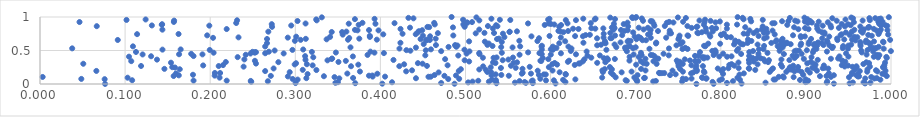
| Category | Series 0 |
|---|---|
| 0.07647637982573963 | 0.001 |
| 0.7713234375897384 | 0.002 |
| 0.7915765868308895 | 0.003 |
| 0.4871062433613019 | 0.004 |
| 0.4022201036759257 | 0.005 |
| 0.9328352677823826 | 0.006 |
| 0.824395686377587 | 0.007 |
| 0.6058112275963091 | 0.008 |
| 0.9695619018061348 | 0.009 |
| 0.9513644047671493 | 0.01 |
| 0.5364083668292864 | 0.011 |
| 0.3704286855123539 | 0.012 |
| 0.579062334779763 | 0.013 |
| 0.30029020890971697 | 0.014 |
| 0.4714186465036029 | 0.015 |
| 0.8072457885731551 | 0.016 |
| 0.5709597656700126 | 0.017 |
| 0.3471701998281966 | 0.018 |
| 0.9757652456273773 | 0.019 |
| 0.8525731390682146 | 0.02 |
| 0.5581101921567309 | 0.021 |
| 0.9245371772040472 | 0.022 |
| 0.9551566800901794 | 0.023 |
| 0.5032116511547893 | 0.024 |
| 0.9677470382751361 | 0.025 |
| 0.41368013751974325 | 0.026 |
| 0.3500511760682547 | 0.027 |
| 0.8993763308446131 | 0.028 |
| 0.6174446341373669 | 0.029 |
| 0.5695015918441472 | 0.03 |
| 0.7903145708085715 | 0.031 |
| 0.9007650499787098 | 0.032 |
| 0.24821853215967682 | 0.033 |
| 0.5358128045901285 | 0.034 |
| 0.5274835921770685 | 0.035 |
| 0.5083026025663702 | 0.036 |
| 0.7545631432089082 | 0.037 |
| 0.7205877358721092 | 0.038 |
| 0.9250561939633402 | 0.039 |
| 0.7017754556604903 | 0.04 |
| 0.26773700650244925 | 0.041 |
| 0.8142946277673381 | 0.042 |
| 0.5778167980161069 | 0.043 |
| 0.5635138541622989 | 0.044 |
| 0.7236949297072365 | 0.045 |
| 0.24766207189808145 | 0.046 |
| 0.6895478597967243 | 0.047 |
| 0.5149571626331519 | 0.048 |
| 0.9027447663789977 | 0.049 |
| 0.21939408377523312 | 0.05 |
| 0.1804432956501263 | 0.051 |
| 0.5789370794786778 | 0.052 |
| 0.5945785322725712 | 0.053 |
| 0.7984291668108743 | 0.054 |
| 0.6038354850212214 | 0.055 |
| 0.1082817355089732 | 0.056 |
| 0.6881709114515945 | 0.057 |
| 0.7012631700531549 | 0.058 |
| 0.5356583200534318 | 0.059 |
| 0.893068472038445 | 0.06 |
| 0.7007007874107786 | 0.061 |
| 0.6146769902397686 | 0.062 |
| 0.8224969875821672 | 0.063 |
| 0.9874906856658142 | 0.064 |
| 0.5310840257423538 | 0.065 |
| 0.3027576321140365 | 0.066 |
| 0.8621425945953757 | 0.067 |
| 0.8641596834299756 | 0.068 |
| 0.6290988340758557 | 0.069 |
| 0.8997078502525034 | 0.07 |
| 0.801304965465901 | 0.071 |
| 0.07598227748682558 | 0.072 |
| 0.7591374107086951 | 0.073 |
| 0.47969384964015327 | 0.074 |
| 0.29690244610174693 | 0.075 |
| 0.04856300646366569 | 0.076 |
| 0.4925680023637015 | 0.077 |
| 0.5879008601093424 | 0.078 |
| 0.7828456253119511 | 0.079 |
| 0.7553565912774245 | 0.08 |
| 0.7656094877592176 | 0.081 |
| 0.980332231881713 | 0.082 |
| 0.969747922555051 | 0.083 |
| 0.35171412124966667 | 0.084 |
| 0.7832034602111443 | 0.085 |
| 0.44178165496080357 | 0.086 |
| 0.31298154861060273 | 0.087 |
| 0.9833093172706803 | 0.088 |
| 0.7098867213316763 | 0.089 |
| 0.36790849983665935 | 0.09 |
| 0.7785132480761858 | 0.091 |
| 0.7107589906821176 | 0.092 |
| 0.8195194611918298 | 0.093 |
| 0.10297060496968935 | 0.094 |
| 0.21103708764094406 | 0.095 |
| 0.6606262967568428 | 0.096 |
| 0.8739529941830546 | 0.097 |
| 0.6984263418114264 | 0.098 |
| 0.7779321902004441 | 0.099 |
| 0.6764749430600118 | 0.1 |
| 0.950647054996109 | 0.101 |
| 0.8855937845791412 | 0.102 |
| 0.34608421794259897 | 0.103 |
| 0.9768081818266305 | 0.104 |
| 0.00312304008840671 | 0.105 |
| 0.9294628737213367 | 0.106 |
| 0.8681162411138694 | 0.107 |
| 0.4564878076853775 | 0.108 |
| 0.4591885922687457 | 0.109 |
| 0.40546229994381966 | 0.11 |
| 0.39090704356849737 | 0.111 |
| 0.9612221053432435 | 0.112 |
| 0.29128534187130567 | 0.113 |
| 0.8730872982302383 | 0.114 |
| 0.962541245086071 | 0.115 |
| 0.3336230480885195 | 0.116 |
| 0.9165266822260036 | 0.117 |
| 0.9950376192721535 | 0.118 |
| 0.15706882099002825 | 0.119 |
| 0.9241892487714695 | 0.12 |
| 0.27125321328903673 | 0.121 |
| 0.4752250439783822 | 0.122 |
| 0.5508968572556726 | 0.123 |
| 0.38655704101158916 | 0.124 |
| 0.20526833131387126 | 0.125 |
| 0.39051090870381244 | 0.126 |
| 0.4888072875986568 | 0.127 |
| 0.5305874981774307 | 0.128 |
| 0.16309741949179568 | 0.129 |
| 0.9592840884746519 | 0.13 |
| 0.9328635679292341 | 0.131 |
| 0.7021567293533167 | 0.132 |
| 0.7403598692984078 | 0.133 |
| 0.46362820632226376 | 0.134 |
| 0.542108186199725 | 0.135 |
| 0.5862325094943189 | 0.136 |
| 0.896691660055855 | 0.137 |
| 0.17976057557751937 | 0.138 |
| 0.6735217343308822 | 0.139 |
| 0.6178510602204882 | 0.14 |
| 0.8219487663469275 | 0.141 |
| 0.5943463672873532 | 0.142 |
| 0.5920193193655443 | 0.143 |
| 0.535451913295029 | 0.144 |
| 0.7469570987730978 | 0.145 |
| 0.9927308121246265 | 0.146 |
| 0.9610194125238118 | 0.147 |
| 0.3144312650077574 | 0.148 |
| 0.6176558744091809 | 0.149 |
| 0.9541768493932247 | 0.15 |
| 0.8026613491680085 | 0.151 |
| 0.9898373825569995 | 0.152 |
| 0.3963722163612588 | 0.153 |
| 0.5661855835061543 | 0.154 |
| 0.5769274205819162 | 0.155 |
| 0.36112705956686075 | 0.156 |
| 0.15979446630808608 | 0.157 |
| 0.8270588964690593 | 0.158 |
| 0.7650779124692071 | 0.159 |
| 0.926973501643361 | 0.16 |
| 0.7282946520240271 | 0.161 |
| 0.7307416281471626 | 0.162 |
| 0.7335985205752558 | 0.163 |
| 0.21164483139790471 | 0.164 |
| 0.20547858216914497 | 0.165 |
| 0.7273934279491568 | 0.166 |
| 0.5671944417140632 | 0.167 |
| 0.9542754717385341 | 0.168 |
| 0.6708623686444652 | 0.169 |
| 0.9045898451370812 | 0.17 |
| 0.7807982935142139 | 0.171 |
| 0.767620156075646 | 0.172 |
| 0.46842160044767756 | 0.173 |
| 0.683481225285979 | 0.174 |
| 0.6106153106721889 | 0.175 |
| 0.5301511406029994 | 0.176 |
| 0.2934184325164167 | 0.177 |
| 0.6614877052019644 | 0.178 |
| 0.525664519841381 | 0.179 |
| 0.8949382542955749 | 0.18 |
| 0.85758581971652 | 0.181 |
| 0.8769607251007685 | 0.182 |
| 0.9720440035797444 | 0.183 |
| 0.7554717978023077 | 0.184 |
| 0.6951656887241267 | 0.185 |
| 0.37595425906443913 | 0.186 |
| 0.9840769554724711 | 0.187 |
| 0.8865899874224761 | 0.188 |
| 0.43026786417312046 | 0.189 |
| 0.7800198387762903 | 0.19 |
| 0.7716521861583229 | 0.191 |
| 0.9633495522202083 | 0.192 |
| 0.2646008371697923 | 0.193 |
| 0.4921366461765714 | 0.194 |
| 0.06622298917313509 | 0.195 |
| 0.8008073091250019 | 0.196 |
| 0.9935559292769638 | 0.197 |
| 0.5848674038653797 | 0.198 |
| 0.9129455374507465 | 0.199 |
| 0.7432556146855355 | 0.2 |
| 0.6022813967823153 | 0.201 |
| 0.711562031673063 | 0.202 |
| 0.6608559194098221 | 0.203 |
| 0.4371717488483966 | 0.204 |
| 0.9823478303748382 | 0.205 |
| 0.8910795816828649 | 0.206 |
| 0.7718695482479873 | 0.207 |
| 0.3248058332112725 | 0.208 |
| 0.9019009955680192 | 0.209 |
| 0.840488751323352 | 0.21 |
| 0.3087456782767038 | 0.211 |
| 0.5238395016673081 | 0.212 |
| 0.9573871123780475 | 0.213 |
| 0.8794747861356426 | 0.214 |
| 0.8827529170450543 | 0.215 |
| 0.8598217342322324 | 0.216 |
| 0.5161902929106109 | 0.217 |
| 0.972364378153096 | 0.218 |
| 0.6720280556062957 | 0.219 |
| 0.1642277682282434 | 0.22 |
| 0.4945270673930318 | 0.221 |
| 0.6636375014499734 | 0.222 |
| 0.802830579742711 | 0.223 |
| 0.7522056644935975 | 0.224 |
| 0.7063696217115867 | 0.225 |
| 0.14618536680341568 | 0.226 |
| 0.5669659120226856 | 0.227 |
| 0.8333758609772516 | 0.228 |
| 0.8851409145309838 | 0.229 |
| 0.9263084211726338 | 0.23 |
| 0.796442828626188 | 0.231 |
| 0.2745110420125875 | 0.232 |
| 0.8612952355038673 | 0.233 |
| 0.8329010410293893 | 0.234 |
| 0.8088624905094565 | 0.235 |
| 0.9197742129397 | 0.236 |
| 0.8210105823880982 | 0.237 |
| 0.7705626833064289 | 0.238 |
| 0.541632979113089 | 0.239 |
| 0.9093340364301934 | 0.24 |
| 0.5590215921131546 | 0.241 |
| 0.9220444125022338 | 0.242 |
| 0.9921938390065449 | 0.243 |
| 0.9103521183888842 | 0.244 |
| 0.9075149547616448 | 0.245 |
| 0.15859204967330975 | 0.246 |
| 0.9907253498167723 | 0.247 |
| 0.9596371557129768 | 0.248 |
| 0.5296516534817423 | 0.249 |
| 0.8811934311241845 | 0.25 |
| 0.15541268293265703 | 0.251 |
| 0.5979651589725896 | 0.252 |
| 0.669663015425234 | 0.253 |
| 0.8907842964977745 | 0.254 |
| 0.9909074028142153 | 0.255 |
| 0.5754413021214181 | 0.256 |
| 0.9547556133181129 | 0.257 |
| 0.8720133453094582 | 0.258 |
| 0.23925206659145107 | 0.259 |
| 0.9751992237191632 | 0.26 |
| 0.9456020503531546 | 0.261 |
| 0.7504884478137754 | 0.262 |
| 0.5207475936204397 | 0.263 |
| 0.9593406090052569 | 0.264 |
| 0.36551347023247155 | 0.265 |
| 0.4222190680593002 | 0.266 |
| 0.7790035841834732 | 0.267 |
| 0.20999706558960052 | 0.268 |
| 0.1187675791028784 | 0.269 |
| 0.45473641797198766 | 0.27 |
| 0.7713359624022298 | 0.271 |
| 0.5533956669036051 | 0.272 |
| 0.8158622221153327 | 0.273 |
| 0.8850676178664606 | 0.274 |
| 0.9495382242649174 | 0.275 |
| 0.9211188770911878 | 0.276 |
| 0.19175714342462793 | 0.277 |
| 0.32039188132142793 | 0.278 |
| 0.47894511361642256 | 0.279 |
| 0.7654756310924113 | 0.28 |
| 0.9422093350636246 | 0.281 |
| 0.21511072038082557 | 0.282 |
| 0.9922389143273949 | 0.283 |
| 0.6283723472076866 | 0.284 |
| 0.8099989876647452 | 0.285 |
| 0.7503479181355882 | 0.286 |
| 0.9113277941508524 | 0.287 |
| 0.7005098939753842 | 0.288 |
| 0.37403418285112927 | 0.289 |
| 0.6076678703578962 | 0.29 |
| 0.8705233996421502 | 0.291 |
| 0.2992702118820362 | 0.292 |
| 0.8432188109509259 | 0.293 |
| 0.42788648013272024 | 0.294 |
| 0.3136081439104943 | 0.295 |
| 0.602004798295826 | 0.296 |
| 0.8126258034561993 | 0.297 |
| 0.9675343165290946 | 0.298 |
| 0.7552597675917789 | 0.299 |
| 0.7245841863150929 | 0.3 |
| 0.7128986750670443 | 0.301 |
| 0.050867971108573974 | 0.302 |
| 0.44953764172237914 | 0.303 |
| 0.909247414617605 | 0.304 |
| 0.2538069697856368 | 0.305 |
| 0.6330413887332856 | 0.306 |
| 0.634333739357792 | 0.307 |
| 0.7092129757361444 | 0.308 |
| 0.9016001641292634 | 0.309 |
| 0.3008969072107489 | 0.31 |
| 0.44407304338702064 | 0.311 |
| 0.9741986891779632 | 0.312 |
| 0.5352274457748127 | 0.313 |
| 0.6048420161158209 | 0.314 |
| 0.8333415328745871 | 0.315 |
| 0.6547507951781866 | 0.316 |
| 0.5564813641665212 | 0.317 |
| 0.15390875394978393 | 0.318 |
| 0.992995947607518 | 0.319 |
| 0.749521338725648 | 0.32 |
| 0.8207498612557683 | 0.321 |
| 0.5323583730911282 | 0.322 |
| 0.5606230761665837 | 0.323 |
| 0.9709786564267093 | 0.324 |
| 0.6643264721153348 | 0.325 |
| 0.2800892433882475 | 0.326 |
| 0.8555790396645632 | 0.327 |
| 0.21833975247017254 | 0.328 |
| 0.35072960748619497 | 0.329 |
| 0.905856138376555 | 0.33 |
| 0.620299325353993 | 0.331 |
| 0.7517849561404284 | 0.332 |
| 0.946254953936544 | 0.333 |
| 0.7710472148729468 | 0.334 |
| 0.8388494788895318 | 0.335 |
| 0.5042805531692741 | 0.336 |
| 0.6378304197497927 | 0.337 |
| 0.8520172310806844 | 0.338 |
| 0.7208956673849337 | 0.339 |
| 0.7060260772067741 | 0.34 |
| 0.10723916646413045 | 0.341 |
| 0.7738554240661505 | 0.342 |
| 0.7698351403233135 | 0.343 |
| 0.5890005563513502 | 0.344 |
| 0.35938165570905656 | 0.345 |
| 0.2525384589059965 | 0.346 |
| 0.5880134721408936 | 0.347 |
| 0.6217159011829595 | 0.348 |
| 0.6926590136274042 | 0.349 |
| 0.7482840783362281 | 0.35 |
| 0.9425503055555714 | 0.351 |
| 0.7638005515982499 | 0.352 |
| 0.3378348928943881 | 0.353 |
| 0.49896546156566113 | 0.354 |
| 0.5437135249873183 | 0.355 |
| 0.856561139717272 | 0.356 |
| 0.8805953038106098 | 0.357 |
| 0.8330160838314539 | 0.358 |
| 0.4153709885279462 | 0.359 |
| 0.9139377586906398 | 0.36 |
| 0.3119963529015769 | 0.361 |
| 0.6647823062351956 | 0.362 |
| 0.6674298090353306 | 0.363 |
| 0.13748080211952488 | 0.364 |
| 0.5503874404663938 | 0.365 |
| 0.8712426761192987 | 0.366 |
| 0.24014314021730876 | 0.367 |
| 0.7577039762710092 | 0.368 |
| 0.6397541900902555 | 0.369 |
| 0.8502453047803977 | 0.37 |
| 0.47605294310102786 | 0.371 |
| 0.5972801809121203 | 0.372 |
| 0.6754909632263466 | 0.373 |
| 0.3426686037674044 | 0.374 |
| 0.8975632196181282 | 0.375 |
| 0.7114674819727632 | 0.376 |
| 0.9294063091767459 | 0.377 |
| 0.7265164573559657 | 0.378 |
| 0.7246168636906567 | 0.379 |
| 0.3433194319595519 | 0.38 |
| 0.9379009052258864 | 0.381 |
| 0.7800588396779176 | 0.382 |
| 0.6665581183027426 | 0.383 |
| 0.8468938494117592 | 0.384 |
| 0.6627015304509242 | 0.385 |
| 0.8425387250254003 | 0.386 |
| 0.5907814466262841 | 0.387 |
| 0.886761236009048 | 0.388 |
| 0.9950352917575211 | 0.389 |
| 0.8372885509447779 | 0.39 |
| 0.5329592584092615 | 0.391 |
| 0.520441602196708 | 0.392 |
| 0.6478116632021378 | 0.393 |
| 0.7842336307050916 | 0.394 |
| 0.5557788967704821 | 0.395 |
| 0.5365779909032927 | 0.396 |
| 0.9848384541329944 | 0.397 |
| 0.7807577666849391 | 0.398 |
| 0.3211031152983421 | 0.399 |
| 0.9065937879048838 | 0.4 |
| 0.23227728695166638 | 0.401 |
| 0.7784511130516778 | 0.402 |
| 0.7036769301353711 | 0.403 |
| 0.9945192786346841 | 0.404 |
| 0.6928508343337134 | 0.405 |
| 0.9798236128637586 | 0.406 |
| 0.807396610909647 | 0.407 |
| 0.10457856911194256 | 0.408 |
| 0.9499271756609752 | 0.409 |
| 0.7981291382315007 | 0.41 |
| 0.3676720713080628 | 0.411 |
| 0.9393736192566341 | 0.412 |
| 0.812601555629992 | 0.413 |
| 0.13055561328902623 | 0.414 |
| 0.7220570852227406 | 0.415 |
| 0.3115530199291037 | 0.416 |
| 0.18041910234883454 | 0.417 |
| 0.8891718056513922 | 0.418 |
| 0.8333520924449603 | 0.419 |
| 0.7697001281920708 | 0.42 |
| 0.8844135626648856 | 0.421 |
| 0.7737137323829519 | 0.422 |
| 0.6432882747143885 | 0.423 |
| 0.9851631872141174 | 0.424 |
| 0.49149961545609466 | 0.425 |
| 0.6579162273046326 | 0.426 |
| 0.7388162420087794 | 0.427 |
| 0.4527731072343046 | 0.428 |
| 0.7070322801830782 | 0.429 |
| 0.7200932633786874 | 0.43 |
| 0.9862902187623362 | 0.431 |
| 0.7916321997311219 | 0.432 |
| 0.7178032716388612 | 0.433 |
| 0.38490528415814873 | 0.434 |
| 0.9833075672334283 | 0.435 |
| 0.24175923811818792 | 0.436 |
| 0.5635472180910294 | 0.437 |
| 0.6002320791785661 | 0.438 |
| 0.9713263519999649 | 0.439 |
| 0.697541729228429 | 0.44 |
| 0.1205691039407681 | 0.441 |
| 0.19090088697586446 | 0.442 |
| 0.6298332984289511 | 0.443 |
| 0.1634228131001856 | 0.444 |
| 0.589637089364203 | 0.445 |
| 0.5164785536400264 | 0.446 |
| 0.874160227324457 | 0.447 |
| 0.8238725602214062 | 0.448 |
| 0.8442300466187255 | 0.449 |
| 0.17769385689390657 | 0.45 |
| 0.895005390382774 | 0.451 |
| 0.7327281170133975 | 0.452 |
| 0.8027213597406201 | 0.453 |
| 0.5012305818582352 | 0.454 |
| 0.24736440190960832 | 0.455 |
| 0.2863455492322993 | 0.456 |
| 0.9472105562950488 | 0.457 |
| 0.6121557219413594 | 0.458 |
| 0.2646334239815435 | 0.459 |
| 0.5868824239909297 | 0.46 |
| 0.4041313487919891 | 0.461 |
| 0.516138280766091 | 0.462 |
| 0.7937049254048172 | 0.463 |
| 0.8548603796831575 | 0.464 |
| 0.7061533567750822 | 0.465 |
| 0.5426983784000741 | 0.466 |
| 0.20401536850358776 | 0.467 |
| 0.39300086496944364 | 0.468 |
| 0.25227008783576566 | 0.469 |
| 0.3476731073713475 | 0.47 |
| 0.9656811239137869 | 0.471 |
| 0.5735709735367011 | 0.472 |
| 0.2524017417208988 | 0.473 |
| 0.908321853796419 | 0.474 |
| 0.25379515347748377 | 0.475 |
| 0.7755422914576623 | 0.476 |
| 0.8334831843125867 | 0.477 |
| 0.11279092606205021 | 0.478 |
| 0.3194820022122654 | 0.479 |
| 0.2496781590958167 | 0.48 |
| 0.7939815849609905 | 0.481 |
| 0.268933919300248 | 0.482 |
| 0.3882809478918815 | 0.483 |
| 0.9247059543533496 | 0.484 |
| 0.64234870043991 | 0.485 |
| 0.9790289158298543 | 0.486 |
| 0.5046542912681073 | 0.487 |
| 0.6896709133609789 | 0.488 |
| 0.8867262420876552 | 0.489 |
| 0.4714298331107325 | 0.49 |
| 0.9999080185802784 | 0.491 |
| 0.8379492060147298 | 0.492 |
| 0.6237639817204536 | 0.493 |
| 0.7899722123016987 | 0.494 |
| 0.8690831350901767 | 0.495 |
| 0.8189900531325972 | 0.496 |
| 0.43523480953980304 | 0.497 |
| 0.8887228721591373 | 0.498 |
| 0.8918077168770168 | 0.499 |
| 0.27572890097632585 | 0.5 |
| 0.9649102566749735 | 0.501 |
| 0.7934529593621933 | 0.502 |
| 0.45335289294580855 | 0.503 |
| 0.9011373046439753 | 0.504 |
| 0.43055031085022194 | 0.505 |
| 0.9723974863114581 | 0.506 |
| 0.9093116822025947 | 0.507 |
| 0.199469282000762 | 0.508 |
| 0.29664118952920376 | 0.509 |
| 0.6655532435838034 | 0.51 |
| 0.6027683707329762 | 0.511 |
| 0.49876613029878397 | 0.512 |
| 0.14392163314085105 | 0.513 |
| 0.589707989517505 | 0.514 |
| 0.30929150994866295 | 0.515 |
| 0.16530000801331027 | 0.516 |
| 0.45937472535738605 | 0.517 |
| 0.8448569632119209 | 0.518 |
| 0.6002642657927147 | 0.519 |
| 0.6881893335356096 | 0.52 |
| 0.8501406661293516 | 0.521 |
| 0.7549439394821569 | 0.522 |
| 0.7608974122253829 | 0.523 |
| 0.9123881154922789 | 0.524 |
| 0.8204896541280116 | 0.525 |
| 0.7161552247133505 | 0.526 |
| 0.9914418686881212 | 0.527 |
| 0.9495367096085856 | 0.528 |
| 0.42240353515187995 | 0.529 |
| 0.6245079550718083 | 0.53 |
| 0.7390959836120933 | 0.531 |
| 0.0378357654959756 | 0.532 |
| 0.980560355276616 | 0.533 |
| 0.6968968194264654 | 0.534 |
| 0.9433737200353746 | 0.535 |
| 0.9824393881810384 | 0.536 |
| 0.9757432967493032 | 0.537 |
| 0.930943678930967 | 0.538 |
| 0.6068484766545612 | 0.539 |
| 0.8690259251599837 | 0.54 |
| 0.7581191771421093 | 0.541 |
| 0.9777824808079999 | 0.542 |
| 0.687452661806302 | 0.543 |
| 0.4417410268525617 | 0.544 |
| 0.8725729875937123 | 0.545 |
| 0.5552845113747497 | 0.546 |
| 0.36486713335635756 | 0.547 |
| 0.7000150720857126 | 0.548 |
| 0.9302785834858266 | 0.549 |
| 0.6772345830897579 | 0.55 |
| 0.5419481986539791 | 0.551 |
| 0.6902167730044896 | 0.552 |
| 0.4800663503317461 | 0.553 |
| 0.9317301035682866 | 0.554 |
| 0.9855379223768503 | 0.555 |
| 0.48920609105370716 | 0.556 |
| 0.5893843703405822 | 0.557 |
| 0.6026466147614211 | 0.558 |
| 0.6209349359680337 | 0.559 |
| 0.2645852807438736 | 0.56 |
| 0.5642681666114593 | 0.561 |
| 0.10924353990522337 | 0.562 |
| 0.7818562627468006 | 0.563 |
| 0.6929929538036664 | 0.564 |
| 0.8668299143656972 | 0.565 |
| 0.9437471996998775 | 0.566 |
| 0.5317423576315251 | 0.567 |
| 0.8508608664962278 | 0.568 |
| 0.9642668041230823 | 0.569 |
| 0.7803371163515468 | 0.57 |
| 0.5897216949710958 | 0.571 |
| 0.4885995301901772 | 0.572 |
| 0.9498065948879177 | 0.573 |
| 0.4905499745538905 | 0.574 |
| 0.9133128931156699 | 0.575 |
| 0.9276046384629592 | 0.576 |
| 0.7478976979771146 | 0.577 |
| 0.6547080413166866 | 0.578 |
| 0.8938006711061408 | 0.579 |
| 0.48771711327170586 | 0.58 |
| 0.46527761489442915 | 0.581 |
| 0.9206810636379099 | 0.582 |
| 0.9095036728693795 | 0.583 |
| 0.5256993544068863 | 0.584 |
| 0.8744189939334206 | 0.585 |
| 0.6593011947735044 | 0.586 |
| 0.9531872809287677 | 0.587 |
| 0.8703641097242764 | 0.588 |
| 0.843220588423308 | 0.589 |
| 0.6751798068852922 | 0.59 |
| 0.8155797091283816 | 0.591 |
| 0.826219032555915 | 0.592 |
| 0.9640817850265676 | 0.593 |
| 0.8820881558375975 | 0.594 |
| 0.824051732647325 | 0.595 |
| 0.4508724901589181 | 0.596 |
| 0.9102358172210644 | 0.597 |
| 0.9033266658116603 | 0.598 |
| 0.7525093641352234 | 0.599 |
| 0.9755244823634847 | 0.6 |
| 0.7991876124451905 | 0.601 |
| 0.785210641274348 | 0.602 |
| 0.8944409858703147 | 0.603 |
| 0.527331211128925 | 0.604 |
| 0.7238735472864296 | 0.605 |
| 0.7530727799961026 | 0.606 |
| 0.6646066591266281 | 0.607 |
| 0.6101779699671116 | 0.608 |
| 0.9189312643197889 | 0.609 |
| 0.26675552078496423 | 0.61 |
| 0.8779300894997314 | 0.611 |
| 0.8314295958788567 | 0.612 |
| 0.8593882388048188 | 0.613 |
| 0.9739380495264895 | 0.614 |
| 0.4235392903634531 | 0.615 |
| 0.6385782728667508 | 0.616 |
| 0.877317573424242 | 0.617 |
| 0.7241635882248644 | 0.618 |
| 0.6637442351556662 | 0.619 |
| 0.9142329422004979 | 0.62 |
| 0.682167613085894 | 0.621 |
| 0.9911641821312008 | 0.622 |
| 0.7550176137178627 | 0.623 |
| 0.8170797825356666 | 0.624 |
| 0.9704634010916828 | 0.625 |
| 0.9638761435965183 | 0.626 |
| 0.5426368205069452 | 0.627 |
| 0.9253282501282954 | 0.628 |
| 0.9038924223954877 | 0.629 |
| 0.8210969230250946 | 0.63 |
| 0.9906663882529626 | 0.631 |
| 0.5227470124320853 | 0.632 |
| 0.8646330802413691 | 0.633 |
| 0.6905061256306876 | 0.634 |
| 0.9800354187297537 | 0.635 |
| 0.5042412311038917 | 0.636 |
| 0.6638292724670752 | 0.637 |
| 0.617123752648804 | 0.638 |
| 0.8724715580231553 | 0.639 |
| 0.8706578997518752 | 0.64 |
| 0.584515016873874 | 0.641 |
| 0.8359524744736737 | 0.642 |
| 0.6939520722440846 | 0.643 |
| 0.2995150444856491 | 0.644 |
| 0.5632356211612016 | 0.645 |
| 0.691397368234957 | 0.646 |
| 0.9245488547375966 | 0.647 |
| 0.8169519488004605 | 0.648 |
| 0.9707836288356969 | 0.649 |
| 0.9579833693947484 | 0.65 |
| 0.45392611170302255 | 0.651 |
| 0.8654005305820878 | 0.652 |
| 0.7120946658604915 | 0.653 |
| 0.7079585235182531 | 0.654 |
| 0.937117860485082 | 0.655 |
| 0.45806151275930684 | 0.656 |
| 0.09137614124202917 | 0.657 |
| 0.9989843511990514 | 0.658 |
| 0.3062712046457912 | 0.659 |
| 0.45390334286205664 | 0.66 |
| 0.3619171474807583 | 0.661 |
| 0.3958215104152916 | 0.662 |
| 0.9542316452061065 | 0.663 |
| 0.8319267124438248 | 0.664 |
| 0.9450484617256553 | 0.665 |
| 0.4574966208021293 | 0.666 |
| 0.336808484623841 | 0.667 |
| 0.7501680269875596 | 0.668 |
| 0.7009960428676293 | 0.669 |
| 0.4472064434382164 | 0.67 |
| 0.5370663167356189 | 0.671 |
| 0.2667930018432146 | 0.672 |
| 0.906076214739695 | 0.673 |
| 0.3123340793539757 | 0.674 |
| 0.8725520815865391 | 0.675 |
| 0.4649573144024659 | 0.676 |
| 0.37520436759130976 | 0.677 |
| 0.5392321186932665 | 0.678 |
| 0.936693340418501 | 0.679 |
| 0.8509916209505365 | 0.68 |
| 0.9191248889534143 | 0.681 |
| 0.6545900344935037 | 0.682 |
| 0.5863720176770116 | 0.683 |
| 0.6703816238892623 | 0.684 |
| 0.6716303903040775 | 0.685 |
| 0.3633755490080585 | 0.686 |
| 0.7507684868885021 | 0.687 |
| 0.7056263189482191 | 0.688 |
| 0.203355816826481 | 0.689 |
| 0.7176488522642016 | 0.69 |
| 0.7358057777105524 | 0.691 |
| 0.2911661552181906 | 0.692 |
| 0.6622360355181134 | 0.693 |
| 0.6120302026684474 | 0.694 |
| 0.8538922917829019 | 0.695 |
| 0.23326321223646865 | 0.696 |
| 0.8942607191031681 | 0.697 |
| 0.8119105581320795 | 0.698 |
| 0.9604957951257597 | 0.699 |
| 0.5457020054173375 | 0.7 |
| 0.8072382222658875 | 0.701 |
| 0.38760385847236967 | 0.702 |
| 0.3409037950503522 | 0.703 |
| 0.9569134740256968 | 0.704 |
| 0.7034359481111625 | 0.705 |
| 0.301051923176568 | 0.706 |
| 0.6987600700228235 | 0.707 |
| 0.927428073519158 | 0.708 |
| 0.7876303493739331 | 0.709 |
| 0.8987507769916154 | 0.71 |
| 0.5774822835161909 | 0.711 |
| 0.4583896251702409 | 0.712 |
| 0.6379749318967591 | 0.713 |
| 0.893901321704905 | 0.714 |
| 0.6287933130295729 | 0.715 |
| 0.8443664804194946 | 0.716 |
| 0.598760227715832 | 0.717 |
| 0.7617454975030269 | 0.718 |
| 0.3875891681774774 | 0.719 |
| 0.9774320114179506 | 0.72 |
| 0.44993967917259015 | 0.721 |
| 0.7515569683911228 | 0.722 |
| 0.6758163224535637 | 0.723 |
| 0.4856658039540606 | 0.724 |
| 0.7609110661552106 | 0.725 |
| 0.19645218659087826 | 0.726 |
| 0.8848794890416224 | 0.727 |
| 0.9406822686773826 | 0.728 |
| 0.6840931336203867 | 0.729 |
| 0.641182485024092 | 0.73 |
| 0.8008297998481738 | 0.731 |
| 0.9732777161684134 | 0.732 |
| 0.9513480358963275 | 0.733 |
| 0.6461615593248471 | 0.734 |
| 0.8002138344883081 | 0.735 |
| 0.7867711357781405 | 0.736 |
| 0.3557272578950962 | 0.737 |
| 0.9966114608341945 | 0.738 |
| 0.7145483379589476 | 0.739 |
| 0.8633594669082318 | 0.74 |
| 0.40336458016196963 | 0.741 |
| 0.9420138511088523 | 0.742 |
| 0.44156172975292485 | 0.743 |
| 0.11408185152208912 | 0.744 |
| 0.9854283934436401 | 0.745 |
| 0.16282305814164869 | 0.746 |
| 0.831261700913878 | 0.747 |
| 0.9218951655438377 | 0.748 |
| 0.6624412867566281 | 0.749 |
| 0.4260164180542674 | 0.75 |
| 0.5439825974979235 | 0.751 |
| 0.8268919337314996 | 0.752 |
| 0.8037089200732418 | 0.753 |
| 0.7168798286527649 | 0.754 |
| 0.739810845794474 | 0.755 |
| 0.5120191740059035 | 0.756 |
| 0.7415456095624774 | 0.757 |
| 0.7735010380412636 | 0.758 |
| 0.46753885201681505 | 0.759 |
| 0.8387072501591891 | 0.76 |
| 0.5335429165223055 | 0.761 |
| 0.670133267739085 | 0.762 |
| 0.522261431082654 | 0.763 |
| 0.8504977608038 | 0.764 |
| 0.7724661916775297 | 0.765 |
| 0.9665276592789505 | 0.766 |
| 0.854760371567583 | 0.767 |
| 0.9218250085057933 | 0.768 |
| 0.9469567695032016 | 0.769 |
| 0.6970144714188652 | 0.77 |
| 0.4439290069158317 | 0.771 |
| 0.9189217611477767 | 0.772 |
| 0.7777877643727416 | 0.773 |
| 0.6150553771149955 | 0.774 |
| 0.3550164804164722 | 0.775 |
| 0.3427875662366025 | 0.776 |
| 0.9864600418225832 | 0.777 |
| 0.5517306996869191 | 0.778 |
| 0.9538862672365973 | 0.779 |
| 0.5519004657196368 | 0.78 |
| 0.2683029619939857 | 0.781 |
| 0.3600593927038985 | 0.782 |
| 0.7827119272400777 | 0.783 |
| 0.6115027689668835 | 0.784 |
| 0.7906000903336634 | 0.785 |
| 0.5604554557901441 | 0.786 |
| 0.9668329254058319 | 0.787 |
| 0.44522566335281255 | 0.788 |
| 0.9646567094308675 | 0.789 |
| 0.7261946390661427 | 0.79 |
| 0.6205639528596725 | 0.791 |
| 0.6091939811059754 | 0.792 |
| 0.6868090719682808 | 0.793 |
| 0.8425061592353702 | 0.794 |
| 0.9149786904137552 | 0.795 |
| 0.7399716558426255 | 0.796 |
| 0.860785926081712 | 0.797 |
| 0.983015189812535 | 0.798 |
| 0.8336547514643731 | 0.799 |
| 0.3977928621385247 | 0.8 |
| 0.3731406827280034 | 0.801 |
| 0.6906498381156868 | 0.802 |
| 0.44917413247335947 | 0.803 |
| 0.9957952490981878 | 0.804 |
| 0.3866228462963368 | 0.805 |
| 0.6827302340411585 | 0.806 |
| 0.7175911597331951 | 0.807 |
| 0.37010394300775 | 0.808 |
| 0.9569716848010033 | 0.809 |
| 0.6737935676622556 | 0.81 |
| 0.14381748376577436 | 0.811 |
| 0.9880202224595569 | 0.812 |
| 0.5161629419468714 | 0.813 |
| 0.709309997466849 | 0.814 |
| 0.9680765613232208 | 0.815 |
| 0.8481664375143437 | 0.816 |
| 0.8504962210887401 | 0.817 |
| 0.8911148322694077 | 0.818 |
| 0.9030939055057635 | 0.819 |
| 0.2193807227847582 | 0.82 |
| 0.6328041279156397 | 0.821 |
| 0.4236643633455254 | 0.822 |
| 0.9798252501756128 | 0.823 |
| 0.8535498858054879 | 0.824 |
| 0.6264080373848523 | 0.825 |
| 0.6525321491810603 | 0.826 |
| 0.913360644062336 | 0.827 |
| 0.8071662340209642 | 0.828 |
| 0.5322265797676876 | 0.829 |
| 0.6619726048324848 | 0.83 |
| 0.7825072340636899 | 0.831 |
| 0.7944836450519617 | 0.832 |
| 0.6479081308660891 | 0.833 |
| 0.6751923362908051 | 0.834 |
| 0.899030225669412 | 0.835 |
| 0.7896252805871455 | 0.836 |
| 0.9387597515885852 | 0.837 |
| 0.7657542932536604 | 0.838 |
| 0.7143551984152331 | 0.839 |
| 0.7036082535035464 | 0.84 |
| 0.43480820067926373 | 0.841 |
| 0.973550073069426 | 0.842 |
| 0.6719920592584631 | 0.843 |
| 0.9732322182274561 | 0.844 |
| 0.4852817872961722 | 0.845 |
| 0.9295947641593572 | 0.846 |
| 0.8861623619445795 | 0.847 |
| 0.8287094317008195 | 0.848 |
| 0.4574038958738567 | 0.849 |
| 0.7715677948272713 | 0.85 |
| 0.9742534211902648 | 0.851 |
| 0.4552465463045284 | 0.852 |
| 0.2726719210770743 | 0.853 |
| 0.49901643618554137 | 0.854 |
| 0.6742336446832689 | 0.855 |
| 0.6100841477334215 | 0.856 |
| 0.7724626662921898 | 0.857 |
| 0.963960429725888 | 0.858 |
| 0.8492347924851222 | 0.859 |
| 0.9458043507569386 | 0.86 |
| 0.6910773325677474 | 0.861 |
| 0.5375175225237442 | 0.862 |
| 0.06670346541103178 | 0.863 |
| 0.7607914342048917 | 0.864 |
| 0.5263536989356531 | 0.865 |
| 0.7341828650538178 | 0.866 |
| 0.9956194931342459 | 0.867 |
| 0.4988556042119074 | 0.868 |
| 0.7219636412896656 | 0.869 |
| 0.9197886850231692 | 0.87 |
| 0.1989478228106111 | 0.871 |
| 0.9129482374489242 | 0.872 |
| 0.29523678456657276 | 0.873 |
| 0.13145362980825245 | 0.874 |
| 0.9289433270164531 | 0.875 |
| 0.9884095948391421 | 0.876 |
| 0.5358834008092461 | 0.877 |
| 0.9526673258042265 | 0.878 |
| 0.9932117784397339 | 0.879 |
| 0.6123170566309831 | 0.88 |
| 0.5930867235640946 | 0.881 |
| 0.8781151241230835 | 0.882 |
| 0.37445271069251945 | 0.883 |
| 0.1430837710913835 | 0.884 |
| 0.7801375806510719 | 0.885 |
| 0.8071378391420359 | 0.886 |
| 0.8191129782377757 | 0.887 |
| 0.6044089075407187 | 0.888 |
| 0.46389258234529657 | 0.889 |
| 0.49746175206515725 | 0.89 |
| 0.949549992431752 | 0.891 |
| 0.14348778373623733 | 0.892 |
| 0.2723257418948258 | 0.893 |
| 0.6859120796930287 | 0.894 |
| 0.941989464785219 | 0.895 |
| 0.600341656799575 | 0.896 |
| 0.9861385349616507 | 0.897 |
| 0.6743702648253491 | 0.898 |
| 0.39420237674008757 | 0.899 |
| 0.36281463501180455 | 0.9 |
| 0.7209561189493802 | 0.901 |
| 0.5978624659874245 | 0.902 |
| 0.3120598511024996 | 0.903 |
| 0.573461684118328 | 0.904 |
| 0.6198748270028974 | 0.905 |
| 0.8605541591101873 | 0.906 |
| 0.8631464030757782 | 0.907 |
| 0.41659903382458413 | 0.908 |
| 0.647224750846826 | 0.909 |
| 0.23057053126165175 | 0.91 |
| 0.902374802030871 | 0.911 |
| 0.4631922332580196 | 0.912 |
| 0.3789245779605778 | 0.913 |
| 0.736610996250587 | 0.914 |
| 0.5023097891564264 | 0.915 |
| 0.6903734748651844 | 0.916 |
| 0.9070686193816995 | 0.917 |
| 0.7443448444518489 | 0.918 |
| 0.5016541611685912 | 0.919 |
| 0.7937454632141939 | 0.92 |
| 0.9257488089839248 | 0.921 |
| 0.9563710835551418 | 0.922 |
| 0.7808251362153671 | 0.923 |
| 0.5076865793185846 | 0.924 |
| 0.0464281977102107 | 0.925 |
| 0.15729085837682413 | 0.926 |
| 0.7393136912180341 | 0.927 |
| 0.9851027019198817 | 0.928 |
| 0.7556795359682327 | 0.929 |
| 0.9150587750221959 | 0.93 |
| 0.9900433946521948 | 0.931 |
| 0.8987745500556117 | 0.932 |
| 0.7988798009220425 | 0.933 |
| 0.89017181792685 | 0.934 |
| 0.835647834267117 | 0.935 |
| 0.7194650871454642 | 0.936 |
| 0.8720007232798392 | 0.937 |
| 0.8793829235140802 | 0.938 |
| 0.7176701628497242 | 0.939 |
| 0.3026540165408948 | 0.94 |
| 0.9049128119690304 | 0.941 |
| 0.7879763191347016 | 0.942 |
| 0.7086107627059807 | 0.943 |
| 0.9362199479292778 | 0.944 |
| 0.8873231542144252 | 0.945 |
| 0.15760139220628266 | 0.946 |
| 0.9666756823506388 | 0.947 |
| 0.7749089901481271 | 0.948 |
| 0.5162392212191486 | 0.949 |
| 0.325159660731379 | 0.95 |
| 0.23159936430851977 | 0.951 |
| 0.9751552957444498 | 0.952 |
| 0.6298037005974377 | 0.953 |
| 0.6178692639980192 | 0.954 |
| 0.5526330365209842 | 0.955 |
| 0.10167335167941474 | 0.956 |
| 0.8493153010617474 | 0.957 |
| 0.5404014412680854 | 0.958 |
| 0.49715017410814466 | 0.959 |
| 0.7814871250422646 | 0.96 |
| 0.59710412511861 | 0.961 |
| 0.9464992796657256 | 0.962 |
| 0.1241362697758026 | 0.963 |
| 0.32461547100557975 | 0.964 |
| 0.6519284368313338 | 0.965 |
| 0.8267807098708106 | 0.966 |
| 0.9017684562922911 | 0.967 |
| 0.3700665537212732 | 0.968 |
| 0.6756558040399598 | 0.969 |
| 0.9857441648196923 | 0.97 |
| 0.8346627913156812 | 0.971 |
| 0.39317023920547883 | 0.972 |
| 0.5986578980671302 | 0.973 |
| 0.5304521436448637 | 0.974 |
| 0.6384019205810848 | 0.975 |
| 0.6528120130601335 | 0.976 |
| 0.9879541011268393 | 0.977 |
| 0.707159322062461 | 0.978 |
| 0.9554116920828658 | 0.979 |
| 0.43884806706987683 | 0.98 |
| 0.9310236754130146 | 0.981 |
| 0.9814734404592576 | 0.982 |
| 0.9746221553369452 | 0.983 |
| 0.6964629679131635 | 0.984 |
| 0.7589846085432945 | 0.985 |
| 0.8811366011337246 | 0.986 |
| 0.43293894780172437 | 0.987 |
| 0.8256800286580607 | 0.988 |
| 0.6998309029363106 | 0.989 |
| 0.8983157533884636 | 0.99 |
| 0.6701168399879365 | 0.991 |
| 0.9533045976744574 | 0.992 |
| 0.7495852681079853 | 0.993 |
| 0.5128115868611094 | 0.994 |
| 0.3311472069621666 | 0.995 |
| 0.6958539081720001 | 0.996 |
| 0.9974533172516183 | 0.997 |
| 0.8197877459828928 | 0.998 |
| 0.7006384494910404 | 0.999 |
| 0.483657105495929 | 1 |